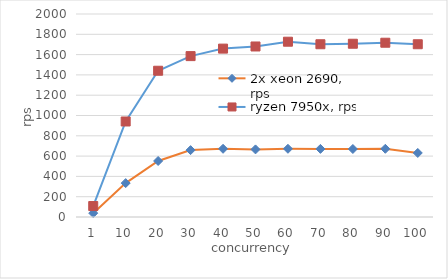
| Category | 2x xeon 2690, rps | ryzen 7950x, rps |
|---|---|---|
| 1 | 38 | 108 |
| 10 | 334 | 941 |
| 20 | 552 | 1441 |
| 30 | 659 | 1585 |
| 40 | 672 | 1659 |
| 50 | 666 | 1680 |
| 60 | 672 | 1727 |
| 70 | 671 | 1702 |
| 80 | 670 | 1707 |
| 90 | 672 | 1717 |
| 100 | 631 | 1702 |